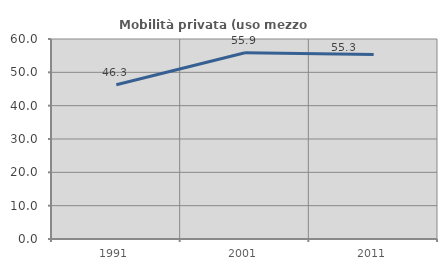
| Category | Mobilità privata (uso mezzo privato) |
|---|---|
| 1991.0 | 46.281 |
| 2001.0 | 55.852 |
| 2011.0 | 55.329 |